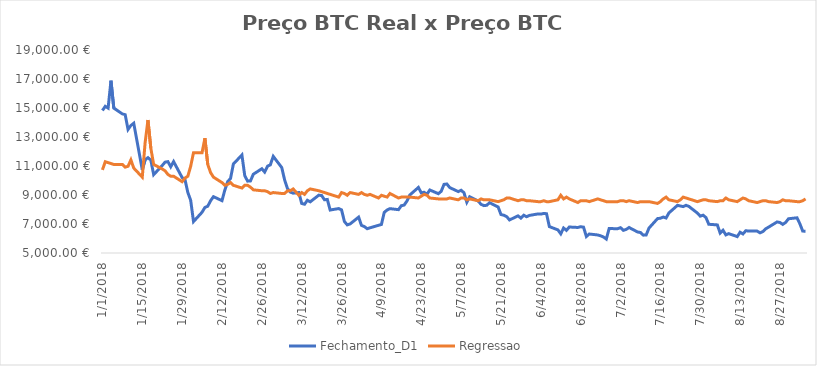
| Category | Fechamento_D1 | Regressao |
|---|---|---|
| 1/1/18 | 14828 | 10732.085 |
| 1/2/18 | 15117.7 | 11295.062 |
| 1/3/18 | 14994.5 | 11232.509 |
| 1/4/18 | 16882 | 11169.956 |
| 1/5/18 | 14995.8 | 11107.403 |
| 1/8/18 | 14590.6 | 11107.403 |
| 1/9/18 | 14544 | 10919.744 |
| 1/10/18 | 13515.8 | 10982.297 |
| 1/11/18 | 13797.3 | 11420.168 |
| 1/12/18 | 13954.1 | 10857.191 |
| 1/15/18 | 10748.1 | 10231.661 |
| 1/16/18 | 11432.9 | 12608.675 |
| 1/17/18 | 11573.4 | 14172.5 |
| 1/18/18 | 11409.6 | 12233.357 |
| 1/19/18 | 10402 | 11107.403 |
| 1/22/18 | 11031.9 | 10794.638 |
| 1/23/18 | 11265.9 | 10669.532 |
| 1/24/18 | 11300.8 | 10419.32 |
| 1/25/18 | 10947.5 | 10294.214 |
| 1/26/18 | 11305.9 | 10294.214 |
| 1/29/18 | 10201 | 9918.896 |
| 1/30/18 | 10064.6 | 10169.108 |
| 1/31/18 | 9176.4 | 10294.214 |
| 2/1/18 | 8635 | 10982.297 |
| 2/2/18 | 7166.7 | 11920.592 |
| 2/5/18 | 7811.5 | 11920.592 |
| 2/6/18 | 8138.3 | 12921.44 |
| 2/7/18 | 8229.7 | 11107.403 |
| 2/8/18 | 8605.5 | 10544.426 |
| 2/9/18 | 8884 | 10231.661 |
| 2/12/18 | 8610 | 9856.343 |
| 2/13/18 | 9343.1 | 9668.684 |
| 2/14/18 | 9922.9 | 9731.237 |
| 2/15/18 | 10138.4 | 9856.343 |
| 2/16/18 | 11137.4 | 9668.684 |
| 2/19/18 | 11760 | 9481.025 |
| 2/20/18 | 10330.2 | 9668.684 |
| 2/21/18 | 9956.7 | 9668.684 |
| 2/22/18 | 9970.2 | 9543.578 |
| 2/23/18 | 10431.1 | 9355.919 |
| 2/26/18 | 10811.5 | 9293.366 |
| 2/27/18 | 10581.5 | 9293.366 |
| 2/28/18 | 10987.6 | 9230.813 |
| 3/1/18 | 11080.3 | 9105.707 |
| 3/2/18 | 11667.1 | 9168.26 |
| 3/5/18 | 10890.1 | 9105.707 |
| 3/6/18 | 10041.7 | 9105.707 |
| 3/7/18 | 9445.8 | 9293.366 |
| 3/8/18 | 9199 | 9293.366 |
| 3/9/18 | 9127.1 | 9418.472 |
| 3/11/18 | 9167.6 | 8980.601 |
| 3/12/18 | 8416.3 | 9168.26 |
| 3/13/18 | 8363.6 | 9043.154 |
| 3/14/18 | 8635.6 | 9293.366 |
| 3/15/18 | 8530.1 | 9418.472 |
| 3/18/18 | 8989.2 | 9293.366 |
| 3/19/18 | 8963.2 | 9230.813 |
| 3/20/18 | 8671.2 | 9168.26 |
| 3/21/18 | 8692.4 | 9105.707 |
| 3/22/18 | 7963.8 | 9043.154 |
| 3/25/18 | 8064.7 | 8855.495 |
| 3/26/18 | 7974.5 | 9168.26 |
| 3/27/18 | 7172 | 9105.707 |
| 3/28/18 | 6938.5 | 8980.601 |
| 3/29/18 | 7003.9 | 9168.26 |
| 4/1/18 | 7473.7 | 9043.154 |
| 4/2/18 | 6903.5 | 9168.26 |
| 4/3/18 | 6823.1 | 9043.154 |
| 4/4/18 | 6674.7 | 8980.601 |
| 4/5/18 | 6736.9 | 9043.154 |
| 4/8/18 | 6912.1 | 8792.942 |
| 4/9/18 | 6966.4 | 8980.601 |
| 4/10/18 | 7802.7 | 8918.048 |
| 4/11/18 | 7965.9 | 8855.495 |
| 4/12/18 | 8058.9 | 9105.707 |
| 4/15/18 | 7989.6 | 8792.942 |
| 4/16/18 | 8261.5 | 8855.495 |
| 4/17/18 | 8305.7 | 8855.495 |
| 4/18/18 | 8595.3 | 8855.495 |
| 4/19/18 | 9003.9 | 8855.495 |
| 4/22/18 | 9522.5 | 8792.942 |
| 4/23/18 | 9145.1 | 8918.048 |
| 4/24/18 | 9190.3 | 9043.154 |
| 4/25/18 | 9047.1 | 8980.601 |
| 4/26/18 | 9345.9 | 8792.942 |
| 4/29/18 | 9091.7 | 8730.389 |
| 4/30/18 | 9254.4 | 8730.389 |
| 5/1/18 | 9733.4 | 8730.389 |
| 5/2/18 | 9758.2 | 8730.389 |
| 5/3/18 | 9511.9 | 8792.942 |
| 5/6/18 | 9235.1 | 8667.836 |
| 5/7/18 | 9328.1 | 8792.942 |
| 5/8/18 | 9158 | 8792.942 |
| 5/9/18 | 8501.9 | 8667.836 |
| 5/10/18 | 8880.3 | 8730.389 |
| 5/13/18 | 8583 | 8605.283 |
| 5/14/18 | 8356.9 | 8730.389 |
| 5/15/18 | 8268.7 | 8667.836 |
| 5/16/18 | 8290.8 | 8667.836 |
| 5/17/18 | 8471.1 | 8667.836 |
| 5/20/18 | 8172.9 | 8542.73 |
| 5/21/18 | 7652.6 | 8605.283 |
| 5/22/18 | 7604.3 | 8667.836 |
| 5/23/18 | 7509.9 | 8792.942 |
| 5/24/18 | 7279.7 | 8792.942 |
| 5/27/18 | 7562.7 | 8605.283 |
| 5/28/18 | 7405.4 | 8667.836 |
| 5/29/18 | 7606.1 | 8667.836 |
| 5/30/18 | 7502.7 | 8605.283 |
| 5/31/18 | 7591.5 | 8605.283 |
| 6/3/18 | 7695.6 | 8542.73 |
| 6/4/18 | 7681.4 | 8542.73 |
| 6/5/18 | 7726 | 8605.283 |
| 6/6/18 | 7710.8 | 8542.73 |
| 6/7/18 | 6820.8 | 8542.73 |
| 6/10/18 | 6594.2 | 8667.836 |
| 6/11/18 | 6324.5 | 8980.601 |
| 6/12/18 | 6722.4 | 8730.389 |
| 6/13/18 | 6562.6 | 8855.495 |
| 6/14/18 | 6792.4 | 8730.389 |
| 6/17/18 | 6761.5 | 8480.177 |
| 6/18/18 | 6813.1 | 8605.283 |
| 6/19/18 | 6781.8 | 8605.283 |
| 6/20/18 | 6137.5 | 8605.283 |
| 6/21/18 | 6309.5 | 8542.73 |
| 6/24/18 | 6243.7 | 8730.389 |
| 6/25/18 | 6185.4 | 8667.836 |
| 6/26/18 | 6104.8 | 8605.283 |
| 6/27/18 | 5962.4 | 8542.73 |
| 6/28/18 | 6684.2 | 8542.73 |
| 7/1/18 | 6677.3 | 8542.73 |
| 7/2/18 | 6746.8 | 8605.283 |
| 7/3/18 | 6564.9 | 8605.283 |
| 7/4/18 | 6629.3 | 8542.73 |
| 7/5/18 | 6758.7 | 8605.283 |
| 7/8/18 | 6448.1 | 8480.177 |
| 7/9/18 | 6413.8 | 8542.73 |
| 7/10/18 | 6231 | 8542.73 |
| 7/11/18 | 6244.6 | 8542.73 |
| 7/12/18 | 6719.9 | 8542.73 |
| 7/15/18 | 7374 | 8417.624 |
| 7/16/18 | 7396.8 | 8542.73 |
| 7/17/18 | 7479.6 | 8730.389 |
| 7/18/18 | 7413.5 | 8855.495 |
| 7/19/18 | 7765 | 8667.836 |
| 7/22/18 | 8286.4 | 8542.73 |
| 7/23/18 | 8242.4 | 8667.836 |
| 7/24/18 | 8200.3 | 8855.495 |
| 7/25/18 | 8288.4 | 8792.942 |
| 7/26/18 | 8214.4 | 8730.389 |
| 7/29/18 | 7752.7 | 8542.73 |
| 7/30/18 | 7540.3 | 8605.283 |
| 7/31/18 | 7605.8 | 8667.836 |
| 8/1/18 | 7447.6 | 8667.836 |
| 8/2/18 | 6981.6 | 8605.283 |
| 8/5/18 | 6937.7 | 8542.73 |
| 8/6/18 | 6375.9 | 8605.283 |
| 8/7/18 | 6567.9 | 8605.283 |
| 8/8/18 | 6248.1 | 8792.942 |
| 8/9/18 | 6334.8 | 8667.836 |
| 8/12/18 | 6131.4 | 8542.73 |
| 8/13/18 | 6431.5 | 8667.836 |
| 8/14/18 | 6315.1 | 8792.942 |
| 8/15/18 | 6535 | 8730.389 |
| 8/16/18 | 6514.7 | 8605.283 |
| 8/19/18 | 6509.2 | 8480.177 |
| 8/20/18 | 6390.9 | 8542.73 |
| 8/21/18 | 6479.3 | 8605.283 |
| 8/22/18 | 6670.8 | 8605.283 |
| 8/23/18 | 6783.5 | 8542.73 |
| 8/26/18 | 7143 | 8480.177 |
| 8/27/18 | 7104.7 | 8542.73 |
| 8/28/18 | 6974.3 | 8667.836 |
| 8/29/18 | 7107.8 | 8605.283 |
| 8/30/18 | 7361.4 | 8605.283 |
| 9/2/18 | 7426.7 | 8542.73 |
| 9/3/18 | 7013.3 | 8542.73 |
| 9/4/18 | 6510.1 | 8605.283 |
| 9/5/18 | 6505.2 | 8730.389 |